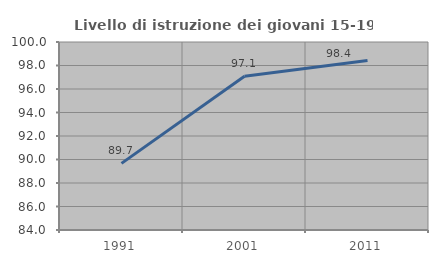
| Category | Livello di istruzione dei giovani 15-19 anni |
|---|---|
| 1991.0 | 89.668 |
| 2001.0 | 97.077 |
| 2011.0 | 98.417 |